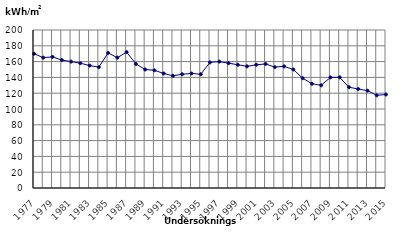
| Category | Elförbrukning |
|---|---|
| 1977 | 170 |
| 1978 | 165 |
| 1979 | 166 |
| 1980 | 162 |
| 1981 | 160 |
| 1982 | 158 |
| 1983 | 155 |
| 1984 | 153 |
| 1985 | 171 |
| 1986 | 165 |
| 1987 | 172 |
| 1988 | 157 |
| 1989 | 150 |
| 1990 | 149 |
| 1991 | 145 |
| 1992 | 142 |
| 1993 | 144 |
| 1994 | 145 |
| 1995 | 144 |
| 1996 | 159 |
| 1997 | 160 |
| 1998 | 158 |
| 1999 | 156 |
| 2000 | 154 |
| 2001 | 156 |
| 2002 | 157 |
| 2003 | 153 |
| 2004 | 154 |
| 2005 | 150 |
| 2006 | 139 |
| 2007 | 132 |
| 2008 | 130 |
| 2009 | 140.005 |
| 2010 | 140.154 |
| 2011 | 127.589 |
| 2012 | 125.319 |
| 2013 | 123.211 |
| 2014 | 117.307 |
| 2015 | 118.356 |